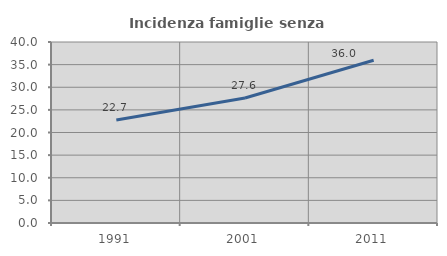
| Category | Incidenza famiglie senza nuclei |
|---|---|
| 1991.0 | 22.744 |
| 2001.0 | 27.628 |
| 2011.0 | 35.956 |